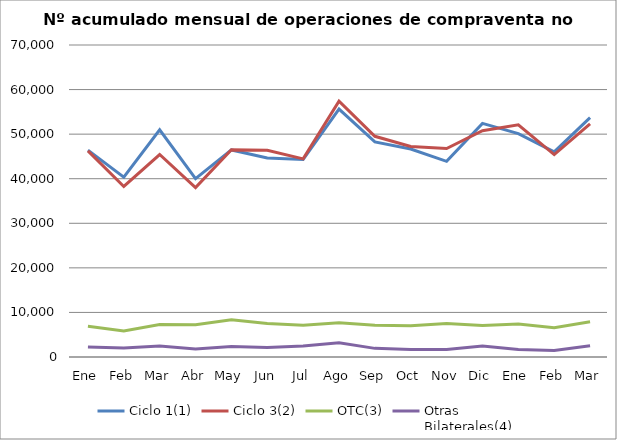
| Category | Ciclo 1(1) | Ciclo 3(2) | OTC(3) | Otras
Bilaterales(4) |
|---|---|---|---|---|
| Ene | 46414 | 46233 | 6904 | 2240 |
| Feb | 40349 | 38263 | 5851 | 2003 |
| Mar | 50963 | 45429 | 7314 | 2460 |
| Abr | 40000 | 37999 | 7259 | 1823 |
| May | 46455 | 46487 | 8374 | 2358 |
| Jun | 44661 | 46376 | 7512 | 2152 |
| Jul | 44310 | 44446 | 7131 | 2447 |
| Ago | 55624 | 57382 | 7694 | 3188 |
| Sep | 48245 | 49514 | 7131 | 1937 |
| Oct | 46665 | 47238 | 7035 | 1679 |
| Nov | 43888 | 46783 | 7542 | 1700 |
| Dic | 52416 | 50765 | 7082 | 2473 |
| Ene | 50130 | 52098 | 7389 | 1669 |
| Feb | 46015 | 45410 | 6563 | 1481 |
| Mar | 53722 | 52322 | 7916 | 2543 |